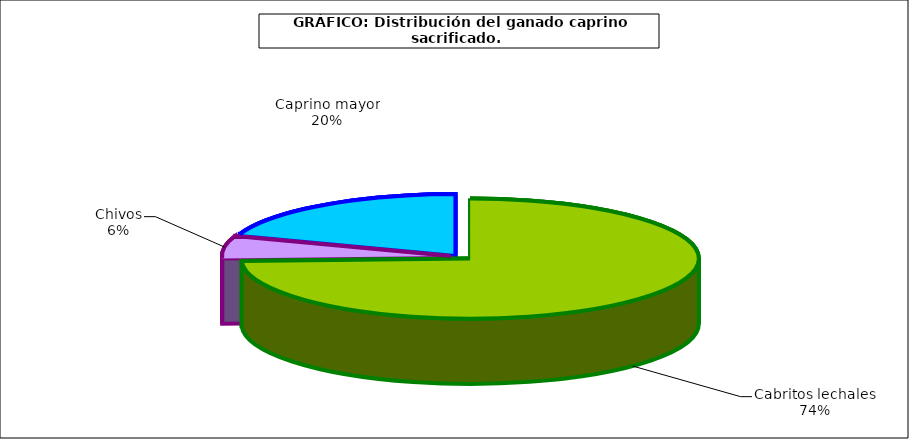
| Category | Series 0 |
|---|---|
| 0 | 899567 |
| 1 | 73064 |
| 2 | 236853 |